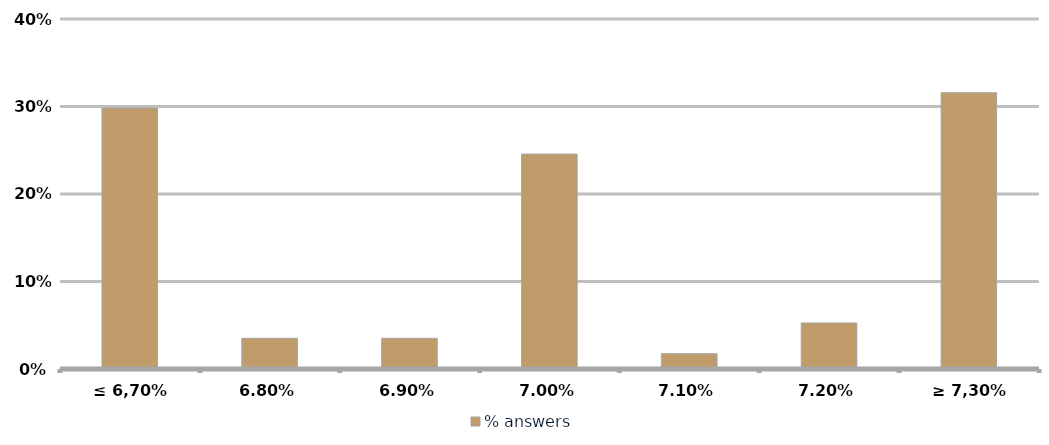
| Category | % answers |
|---|---|
| ≤ 6,70% | 0.298 |
| 6,80% | 0.035 |
| 6,90% | 0.035 |
| 7,00% | 0.246 |
| 7,10% | 0.018 |
| 7,20% | 0.053 |
| ≥ 7,30% | 0.316 |